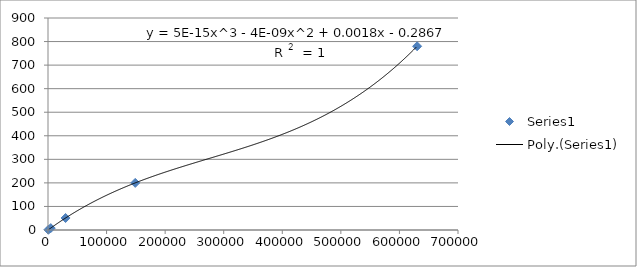
| Category | Series 0 |
|---|---|
| 623.0 | 1 |
| 4698.0 | 8 |
| 30000.0 | 51 |
| 148960.0 | 200 |
| 630216.0 | 780 |